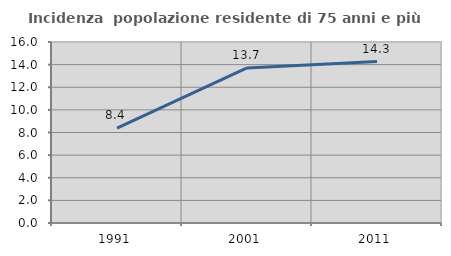
| Category | Incidenza  popolazione residente di 75 anni e più |
|---|---|
| 1991.0 | 8.394 |
| 2001.0 | 13.706 |
| 2011.0 | 14.268 |